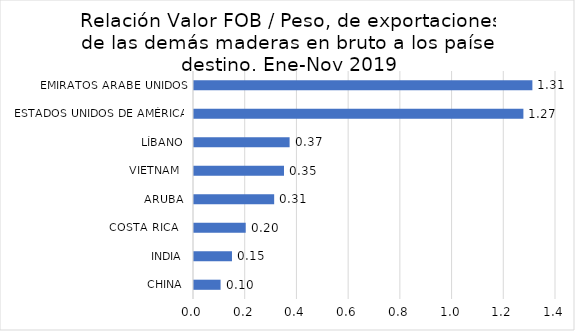
| Category | Series 0 |
|---|---|
| CHINA | 0.103 |
| INDIA | 0.147 |
| COSTA RICA   | 0.2 |
| ARUBA | 0.31 |
| VIETNAM  | 0.348 |
| LÍBANO | 0.37 |
| ESTADOS UNIDOS DE AMÉRICA | 1.274 |
| EMIRATOS ARABE UNIDOS | 1.309 |